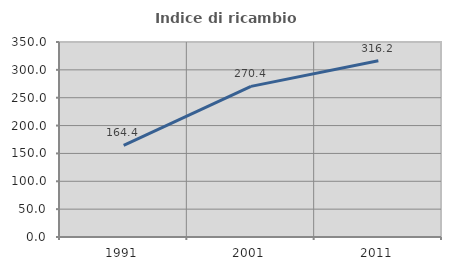
| Category | Indice di ricambio occupazionale  |
|---|---|
| 1991.0 | 164.41 |
| 2001.0 | 270.36 |
| 2011.0 | 316.237 |